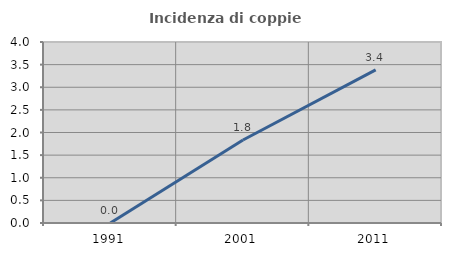
| Category | Incidenza di coppie miste |
|---|---|
| 1991.0 | 0 |
| 2001.0 | 1.835 |
| 2011.0 | 3.383 |